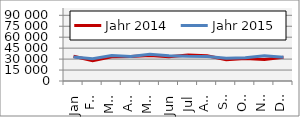
| Category | Jahr 2014 | Jahr 2015 |
|---|---|---|
| Jan | 33792.31 | 32875.301 |
| Feb | 27849.919 | 30632.277 |
| Mär | 33093.682 | 34892.608 |
| Apr | 33702.136 | 33560.022 |
| Mai | 34935.965 | 36592.337 |
| Jun | 33225.265 | 34680.457 |
| Jul | 35617.695 | 33818.379 |
| Aug | 34496.403 | 33582.294 |
| Sep | 29052.202 | 31015.605 |
| Okt | 30766.307 | 31788.291 |
| Nov | 29533.016 | 34594.593 |
| Dez | 32501.765 | 32432.711 |